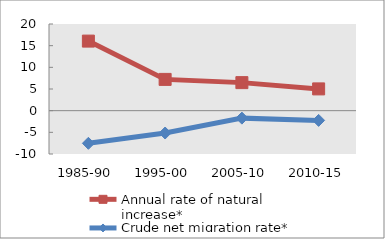
| Category | Annual rate of natural increase* | Crude net migration rate* |
|---|---|---|
| 1985-90 | 16.054 | -7.534 |
| 1995-00 | 7.217 | -5.16 |
| 2005-10 | 6.471 | -1.722 |
| 2010-15 | 5.025 | -2.243 |